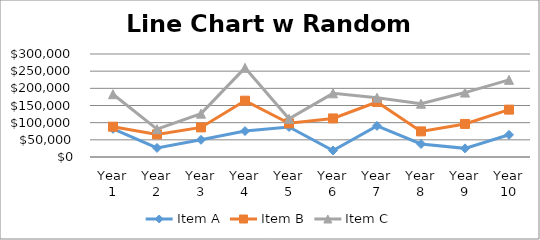
| Category | Item A | Item B | Item C |
|---|---|---|---|
| Year 1 | 82172 | 6098 | 94586 |
| Year 2 | 26456 | 39459 | 15191 |
| Year 3 | 50146 | 36023 | 40120 |
| Year 4 | 75515 | 88460 | 95693 |
| Year 5 | 87376 | 10682 | 13097 |
| Year 6 | 18847 | 93480 | 73086 |
| Year 7 | 90563 | 69708 | 12337 |
| Year 8 | 37858 | 36744 | 80548 |
| Year 9 | 25152 | 71175 | 91333 |
| Year 10 | 64662 | 73316 | 86772 |